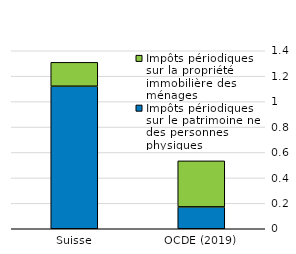
| Category | Impôts périodiques sur le patrimoine net des personnes physiques | Impôts périodiques sur la propriété immobilière des ménages |
|---|---|---|
| Suisse | 1.121 | 0.188 |
| OCDE (2019) | 0.172 | 0.362 |